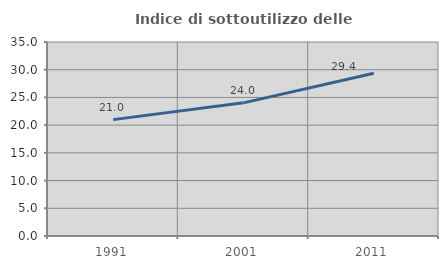
| Category | Indice di sottoutilizzo delle abitazioni  |
|---|---|
| 1991.0 | 20.995 |
| 2001.0 | 24.022 |
| 2011.0 | 29.375 |